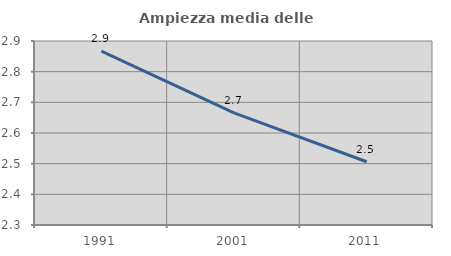
| Category | Ampiezza media delle famiglie |
|---|---|
| 1991.0 | 2.867 |
| 2001.0 | 2.665 |
| 2011.0 | 2.506 |